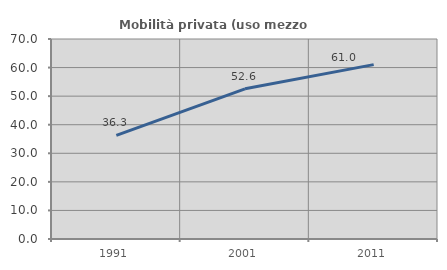
| Category | Mobilità privata (uso mezzo privato) |
|---|---|
| 1991.0 | 36.257 |
| 2001.0 | 52.564 |
| 2011.0 | 61.035 |